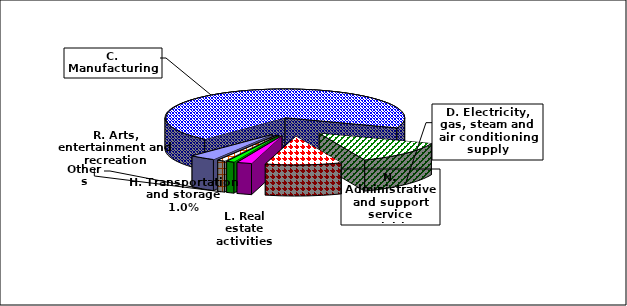
| Category | Series 0 |
|---|---|
| C. Manufacturing | 95772.731 |
| D. Electricity, gas, steam and air conditioning supply | 18091.427 |
| N. Administrative and support service activities | 14250.613 |
| L. Real estate activities | 2810.58 |
| H. Transportation and storage | 1435.729 |
| R. Arts, entertainment and recreation | 1414.59 |
| Others | 4842.382 |